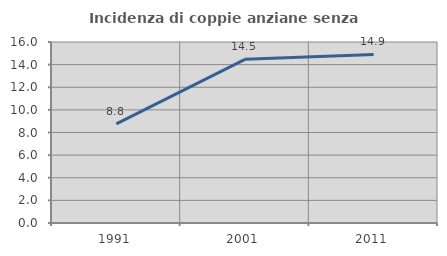
| Category | Incidenza di coppie anziane senza figli  |
|---|---|
| 1991.0 | 8.766 |
| 2001.0 | 14.468 |
| 2011.0 | 14.903 |